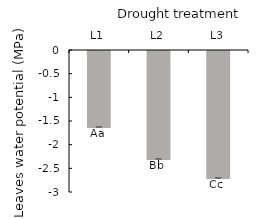
| Category | Leaves water potential |
|---|---|
| L1 | -1.626 |
| L2 | -2.301 |
| L3 | -2.702 |